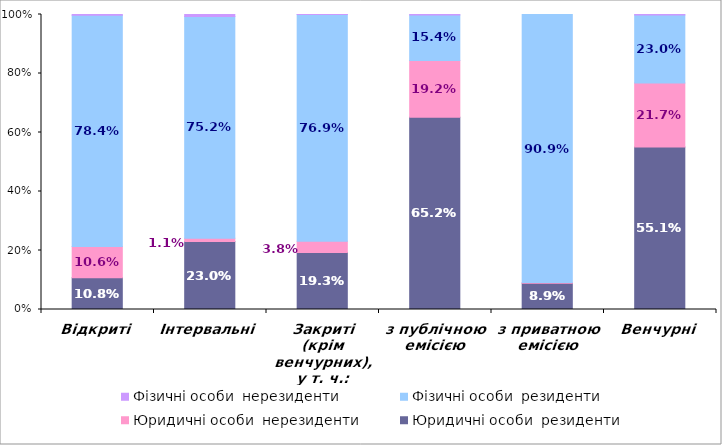
| Category | Юридичні особи  | Фізичні особи  |
|---|---|---|
| Відкриті | 0.106 | 0.003 |
| Інтервальні | 0.011 | 0.007 |
| Закриті (крім венчурних), у т. ч.: | 0.038 | 0 |
| з публічною емісією | 0.192 | 0.002 |
| з приватною емісією | 0.002 | 0 |
| Венчурні | 0.217 | 0.002 |